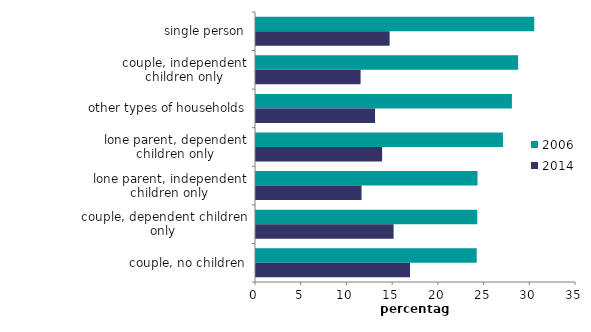
| Category | 2006 | 2014 |
|---|---|---|
| single person | 30.432 | 14.617 |
| couple, independent children only | 28.67 | 11.441 |
| other types of households | 27.99 | 13.019 |
| lone parent, dependent children only | 27.008 | 13.794 |
| lone parent, independent children only | 24.226 | 11.545 |
| couple, dependent children only | 24.204 | 15.05 |
| couple, no children | 24.144 | 16.851 |